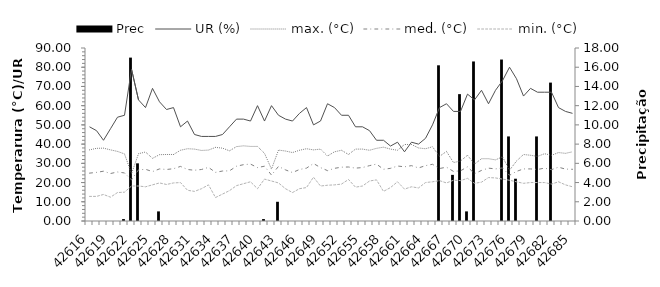
| Category | Prec |
|---|---|
| 2016-09-03 | 0 |
| 2016-09-04 | 0 |
| 2016-09-05 | 0 |
| 2016-09-06 | 0 |
| 2016-09-07 | 0 |
| 2016-09-08 | 0.2 |
| 2016-09-09 | 17 |
| 2016-09-10 | 6 |
| 2016-09-11 | 0 |
| 2016-09-12 | 0 |
| 2016-09-13 | 1 |
| 2016-09-14 | 0 |
| 2016-09-15 | 0 |
| 2016-09-16 | 0 |
| 2016-09-17 | 0 |
| 2016-09-18 | 0 |
| 2016-09-19 | 0 |
| 2016-09-20 | 0 |
| 2016-09-21 | 0 |
| 2016-09-22 | 0 |
| 2016-09-23 | 0 |
| 2016-09-24 | 0 |
| 2016-09-25 | 0 |
| 2016-09-26 | 0 |
| 2016-09-27 | 0 |
| 2016-09-28 | 0.2 |
| 2016-09-29 | 0 |
| 2016-09-30 | 2 |
| 2016-10-01 | 0 |
| 2016-10-02 | 0 |
| 2016-10-03 | 0 |
| 2016-10-04 | 0 |
| 2016-10-05 | 0 |
| 2016-10-06 | 0 |
| 2016-10-07 | 0 |
| 2016-10-08 | 0 |
| 2016-10-09 | 0 |
| 2016-10-10 | 0 |
| 2016-10-11 | 0 |
| 2016-10-12 | 0 |
| 2016-10-13 | 0 |
| 2016-10-14 | 0 |
| 2016-10-15 | 0 |
| 2016-10-16 | 0 |
| 2016-10-17 | 0 |
| 2016-10-18 | 0 |
| 2016-10-19 | 0 |
| 2016-10-20 | 0 |
| 2016-10-21 | 0 |
| 2016-10-22 | 0 |
| 2016-10-23 | 16.2 |
| 2016-10-24 | 0 |
| 2016-10-25 | 4.8 |
| 2016-10-26 | 13.2 |
| 2016-10-27 | 1 |
| 2016-10-28 | 16.6 |
| 2016-10-29 | 0 |
| 2016-10-30 | 0 |
| 2016-10-31 | 0 |
| 2016-11-01 | 16.8 |
| 2016-11-02 | 8.8 |
| 2016-11-03 | 4.4 |
| 2016-11-04 | 0 |
| 2016-11-05 | 0 |
| 2016-11-06 | 8.8 |
| 2016-11-07 | 0 |
| 2016-11-08 | 14.4 |
| 2016-11-09 | 0 |
| 2016-11-10 | 0 |
| 2016-11-11 | 0 |